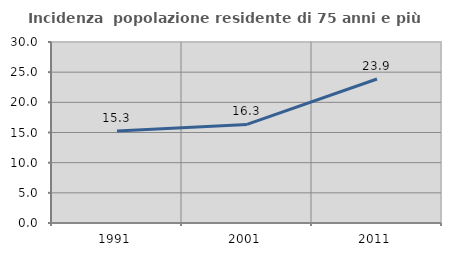
| Category | Incidenza  popolazione residente di 75 anni e più |
|---|---|
| 1991.0 | 15.257 |
| 2001.0 | 16.341 |
| 2011.0 | 23.861 |